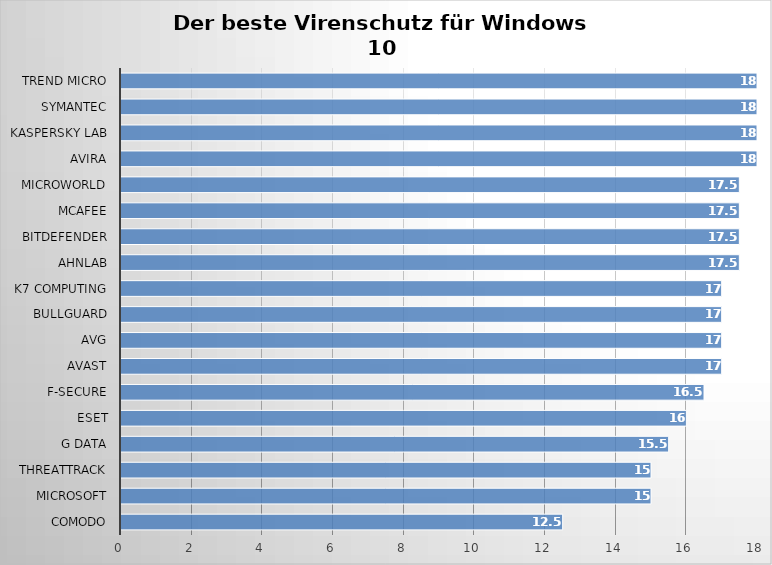
| Category | Series 0 |
|---|---|
| Comodo | 12.5 |
| Microsoft | 15 |
| ThreatTrack | 15 |
| G Data | 15.5 |
| ESET | 16 |
| F-Secure | 16.5 |
| Avast | 17 |
| AVG | 17 |
| BullGuard | 17 |
| K7 Computing | 17 |
| AhnLab | 17.5 |
| Bitdefender | 17.5 |
| McAfee | 17.5 |
| Microworld | 17.5 |
| Avira | 18 |
| Kaspersky Lab | 18 |
| Symantec | 18 |
| Trend Micro | 18 |